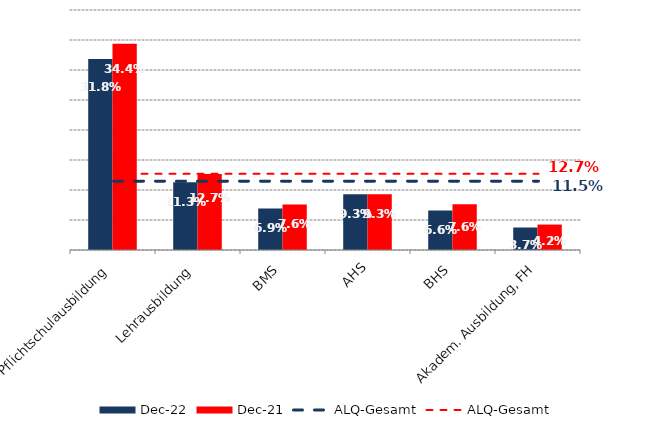
| Category | Dez 22 | Dez 21 |
|---|---|---|
| Pflichtschulausbildung | 0.318 | 0.344 |
| Lehrausbildung | 0.113 | 0.127 |
| BMS | 0.069 | 0.076 |
| AHS | 0.093 | 0.093 |
| BHS | 0.066 | 0.076 |
| Akadem. Ausbildung, FH | 0.037 | 0.042 |